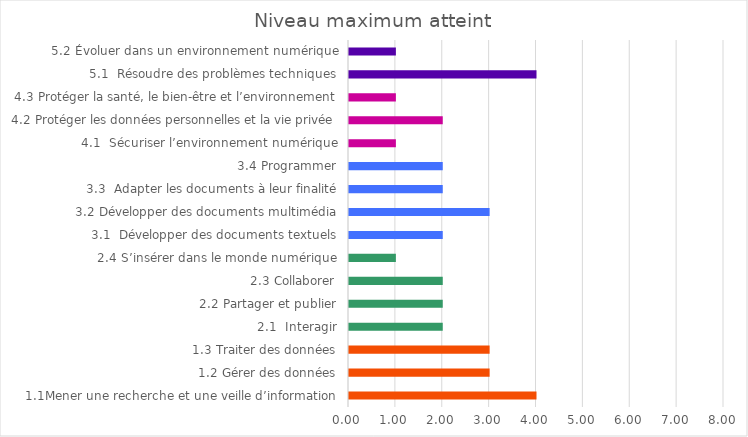
| Category | Series 0 |
|---|---|
| 1.1Mener une recherche et une veille d’information | 4 |
| 1.2 Gérer des données | 3 |
| 1.3 Traiter des données | 3 |
| 2.1  Interagir | 2 |
| 2.2 Partager et publier | 2 |
| 2.3 Collaborer | 2 |
| 2.4 S’insérer dans le monde numérique | 1 |
| 3.1  Développer des documents textuels | 2 |
| 3.2 Développer des documents multimédia | 3 |
| 3.3  Adapter les documents à leur finalité | 2 |
| 3.4 Programmer | 2 |
| 4.1  Sécuriser l’environnement numérique | 1 |
| 4.2 Protéger les données personnelles et la vie privée | 2 |
| 4.3 Protéger la santé, le bien-être et l’environnement | 1 |
| 5.1  Résoudre des problèmes techniques | 4 |
| 5.2 Évoluer dans un environnement numérique | 1 |